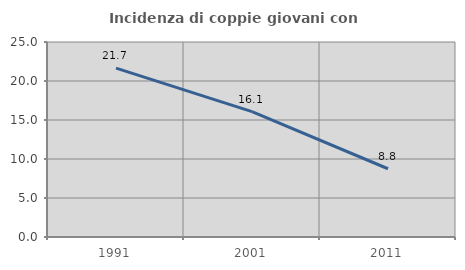
| Category | Incidenza di coppie giovani con figli |
|---|---|
| 1991.0 | 21.65 |
| 2001.0 | 16.081 |
| 2011.0 | 8.75 |